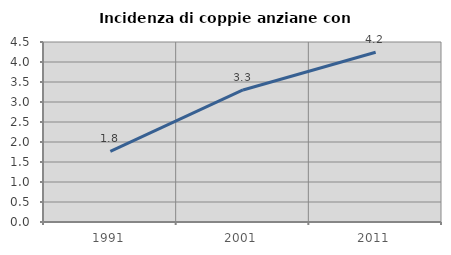
| Category | Incidenza di coppie anziane con figli |
|---|---|
| 1991.0 | 1.766 |
| 2001.0 | 3.301 |
| 2011.0 | 4.245 |